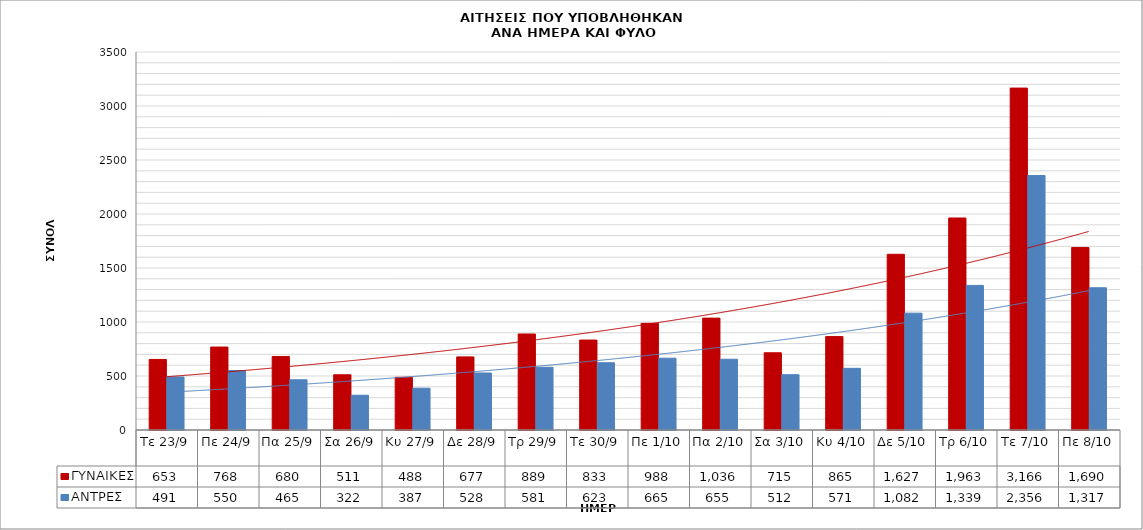
| Category | ΓΥΝΑΙΚΕΣ | ΑΝΤΡΕΣ |
|---|---|---|
| Τε 23/9 | 653 | 491 |
| Πε 24/9 | 768 | 550 |
| Πα 25/9 | 680 | 465 |
| Σα 26/9 | 511 | 322 |
| Κυ 27/9 | 488 | 387 |
| Δε 28/9 | 677 | 528 |
| Τρ 29/9 | 889 | 581 |
| Τε 30/9 | 833 | 623 |
| Πε 1/10 | 988 | 665 |
| Πα 2/10 | 1036 | 655 |
| Σα 3/10 | 715 | 512 |
| Κυ 4/10 | 865 | 571 |
| Δε 5/10 | 1627 | 1082 |
| Τρ 6/10 | 1963 | 1339 |
| Τε 7/10 | 3166 | 2356 |
| Πε 8/10 | 1690 | 1317 |